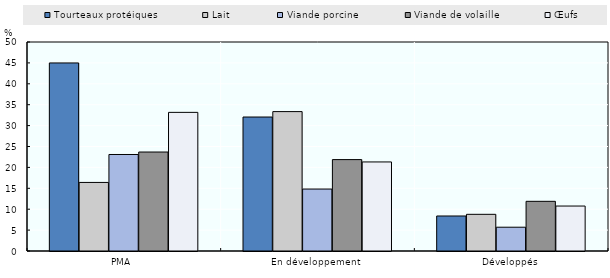
| Category | Tourteaux protéiques | Lait | Viande porcine | Viande de volaille | Œufs |
|---|---|---|---|---|---|
| PMA | 44.989 | 16.405 | 23.089 | 23.679 | 33.167 |
| En développement | 32.05 | 33.349 | 14.822 | 21.865 | 21.304 |
| Développés | 8.375 | 8.774 | 5.692 | 11.884 | 10.756 |